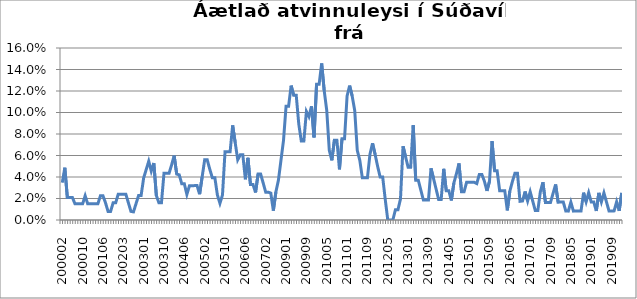
| Category | Series 0 |
|---|---|
| 200002 | 0.035 |
| 200003 | 0.049 |
| 200004 | 0.021 |
| 200005 | 0.021 |
| 200006 | 0.021 |
| 200007 | 0.015 |
| 200008 | 0.015 |
| 200009 | 0.015 |
| 200010 | 0.015 |
| 200011 | 0.023 |
| 200012 | 0.015 |
| 200101 | 0.015 |
| 200102 | 0.015 |
| 200103 | 0.015 |
| 200104 | 0.015 |
| 200105 | 0.023 |
| 200106 | 0.023 |
| 200107 | 0.016 |
| 200108 | 0.008 |
| 200110 | 0.008 |
| 200111 | 0.016 |
| 200112 | 0.016 |
| 200201 | 0.024 |
| 200202 | 0.024 |
| 200203 | 0.024 |
| 200204 | 0.024 |
| 200205 | 0.016 |
| 200206 | 0.008 |
| 200209 | 0.008 |
| 200210 | 0.015 |
| 200211 | 0.023 |
| 200212 | 0.023 |
| 200301 | 0.039 |
| 200302 | 0.047 |
| 200303 | 0.055 |
| 200304 | 0.045 |
| 200305 | 0.053 |
| 200306 | 0.023 |
| 200307 | 0.016 |
| 200309 | 0.016 |
| 200310 | 0.043 |
| 200311 | 0.043 |
| 200312 | 0.043 |
| 200401 | 0.051 |
| 200402 | 0.06 |
| 200403 | 0.043 |
| 200404 | 0.042 |
| 200405 | 0.034 |
| 200406 | 0.034 |
| 200407 | 0.024 |
| 200408 | 0.032 |
| 200409 | 0.032 |
| 200410 | 0.032 |
| 200411 | 0.032 |
| 200412 | 0.024 |
| 200501 | 0.04 |
| 200502 | 0.056 |
| 200503 | 0.056 |
| 200504 | 0.047 |
| 200505 | 0.039 |
| 200506 | 0.039 |
| 200507 | 0.023 |
| 200508 | 0.016 |
| 200509 | 0.023 |
| 200510 | 0.063 |
| 200511 | 0.063 |
| 200512 | 0.063 |
| 200601 | 0.088 |
| 200602 | 0.072 |
| 200603 | 0.056 |
| 200604 | 0.061 |
| 200605 | 0.061 |
| 200606 | 0.038 |
| 200607 | 0.058 |
| 200608 | 0.033 |
| 200609 | 0.033 |
| 200610 | 0.026 |
| 200611 | 0.043 |
| 200612 | 0.043 |
| 200701 | 0.034 |
| 200702 | 0.026 |
| 200703 | 0.026 |
| 200704 | 0.025 |
| 200709 | 0.009 |
| 200809 | 0.026 |
| 200810 | 0.037 |
| 200811 | 0.056 |
| 200812 | 0.074 |
| 200901 | 0.106 |
| 200902 | 0.106 |
| 200903 | 0.125 |
| 200904 | 0.116 |
| 200905 | 0.116 |
| 200906 | 0.089 |
| 200907 | 0.073 |
| 200908 | 0.073 |
| 200909 | 0.101 |
| 200910 | 0.096 |
| 200911 | 0.106 |
| 200912 | 0.077 |
| 201001 | 0.126 |
| 201002 | 0.126 |
| 201003 | 0.146 |
| 201004 | 0.12 |
| 201005 | 0.102 |
| 201006 | 0.065 |
| 201007 | 0.056 |
| 201008 | 0.074 |
| 201009 | 0.074 |
| 201010 | 0.047 |
| 201011 | 0.075 |
| 201012 | 0.075 |
| 201101 | 0.115 |
| 201102 | 0.125 |
| 201103 | 0.115 |
| 201104 | 0.102 |
| 201105 | 0.065 |
| 201106 | 0.056 |
| 201107 | 0.039 |
| 201108 | 0.039 |
| 201109 | 0.039 |
| 201110 | 0.061 |
| 201111 | 0.071 |
| 201112 | 0.061 |
| 201201 | 0.05 |
| 201202 | 0.04 |
| 201203 | 0.04 |
| 201204 | 0.019 |
| 201205 | 0 |
| 201206 | 0 |
| 201207 | 0 |
| 201208 | 0.01 |
| 201209 | 0.01 |
| 201210 | 0.02 |
| 201211 | 0.069 |
| 201212 | 0.059 |
| 201301 | 0.049 |
| 201302 | 0.049 |
| 201303 | 0.088 |
| 201304 | 0.037 |
| 201305 | 0.037 |
| 201306 | 0.028 |
| 201307 | 0.019 |
| 201308 | 0.019 |
| 201309 | 0.019 |
| 201310 | 0.048 |
| 201311 | 0.038 |
| 201312 | 0.029 |
| 201401 | 0.019 |
| 201402 | 0.019 |
| 201403 | 0.048 |
| 201404 | 0.027 |
| 201405 | 0.027 |
| 201406 | 0.018 |
| 201407 | 0.034 |
| 201408 | 0.043 |
| 201409 | 0.053 |
| 201410 | 0.026 |
| 201411 | 0.026 |
| 201412 | 0.035 |
| 201501 | 0.035 |
| 201502 | 0.035 |
| 201503 | 0.035 |
| 201504 | 0.034 |
| 201505 | 0.042 |
| 201506 | 0.042 |
| 201507 | 0.036 |
| 201508 | 0.027 |
| 201509 | 0.036 |
| 201510 | 0.073 |
| 201511 | 0.046 |
| 201512 | 0.046 |
| 201601 | 0.027 |
| 201602 | 0.027 |
| 201603 | 0.027 |
| 201604 | 0.009 |
| 201605 | 0.027 |
| 201606 | 0.036 |
| 201607 | 0.043 |
| 201608 | 0.043 |
| 201609 | 0.017 |
| 201610 | 0.018 |
| 201611 | 0.027 |
| 201612 | 0.018 |
| 201701 | 0.026 |
| 201702 | 0.018 |
| 201703 | 0.009 |
| 201704 | 0.009 |
| 201705 | 0.026 |
| 201706 | 0.035 |
| 201707 | 0.016 |
| 201708 | 0.016 |
| 201709 | 0.016 |
| 201710 | 0.025 |
| 201711 | 0.033 |
| 201712 | 0.017 |
| 201801 | 0.017 |
| 201802 | 0.017 |
| 201803 | 0.008 |
| 201804 | 0.008 |
| 201805 | 0.017 |
| 201806 | 0.008 |
| 201807 | 0.008 |
| 201808 | 0.008 |
| 201809 | 0.008 |
| 201810 | 0.025 |
| 201811 | 0.017 |
| 201812 | 0.025 |
| 201901 | 0.017 |
| 201902 | 0.017 |
| 201903 | 0.008 |
| 201904 | 0.025 |
| 201905 | 0.017 |
| 201906 | 0.025 |
| 201907 | 0.017 |
| 201908 | 0.008 |
| 201909 | 0.008 |
| 201910 | 0.008 |
| 201911 | 0.017 |
| 201912 | 0.008 |
| 202001 | 0.025 |